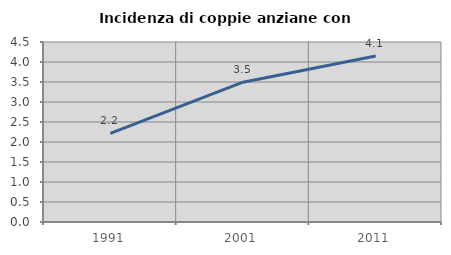
| Category | Incidenza di coppie anziane con figli |
|---|---|
| 1991.0 | 2.218 |
| 2001.0 | 3.495 |
| 2011.0 | 4.15 |